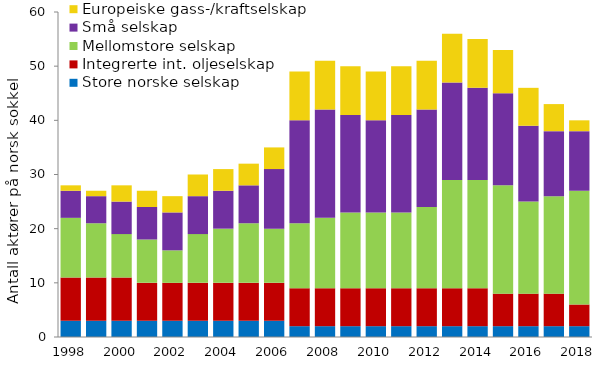
| Category | Store norske selskap | Integrerte int. oljeselskap | Mellomstore selskap | Små selskap | Europeiske gass-/kraftselskap |
|---|---|---|---|---|---|
| 1998.0 | 3 | 8 | 11 | 5 | 1 |
| 1999.0 | 3 | 8 | 10 | 5 | 1 |
| 2000.0 | 3 | 8 | 8 | 6 | 3 |
| 2001.0 | 3 | 7 | 8 | 6 | 3 |
| 2002.0 | 3 | 7 | 6 | 7 | 3 |
| 2003.0 | 3 | 7 | 9 | 7 | 4 |
| 2004.0 | 3 | 7 | 10 | 7 | 4 |
| 2005.0 | 3 | 7 | 11 | 7 | 4 |
| 2006.0 | 3 | 7 | 10 | 11 | 4 |
| 2007.0 | 2 | 7 | 12 | 19 | 9 |
| 2008.0 | 2 | 7 | 13 | 20 | 9 |
| 2009.0 | 2 | 7 | 14 | 18 | 9 |
| 2010.0 | 2 | 7 | 14 | 17 | 9 |
| 2011.0 | 2 | 7 | 14 | 18 | 9 |
| 2012.0 | 2 | 7 | 15 | 18 | 9 |
| 2013.0 | 2 | 7 | 20 | 18 | 9 |
| 2014.0 | 2 | 7 | 20 | 17 | 9 |
| 2015.0 | 2 | 6 | 20 | 17 | 8 |
| 2016.0 | 2 | 6 | 17 | 14 | 7 |
| 2017.0 | 2 | 6 | 18 | 12 | 5 |
| 2018.0 | 2 | 4 | 21 | 11 | 2 |